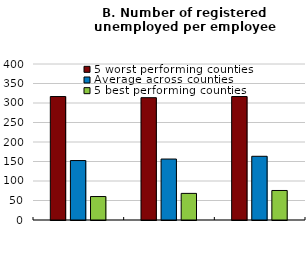
| Category | 5 worst performing counties | Average across counties | 5 best performing counties |
|---|---|---|---|
|  | 316.566 | 152.438 | 60.141 |
|  | 313.624 | 156.309 | 68.26 |
|  | 316.567 | 163.366 | 75.707 |